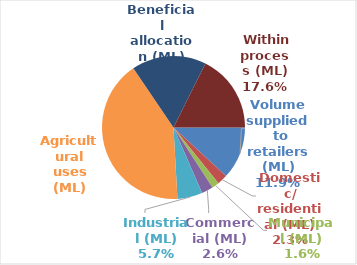
| Category | Series 3 |
|---|---|
| Volume supplied  to retailers (ML) | 0.119 |
| Domestic/ residential (ML) | 0.023 |
| Municipal (ML) | 0.016 |
| Commercial (ML) | 0.026 |
| Industrial (ML) | 0.057 |
| Agricultural uses (ML) | 0.414 |
| Beneficial allocation (ML) | 0.169 |
|  Within process (ML) | 0.176 |